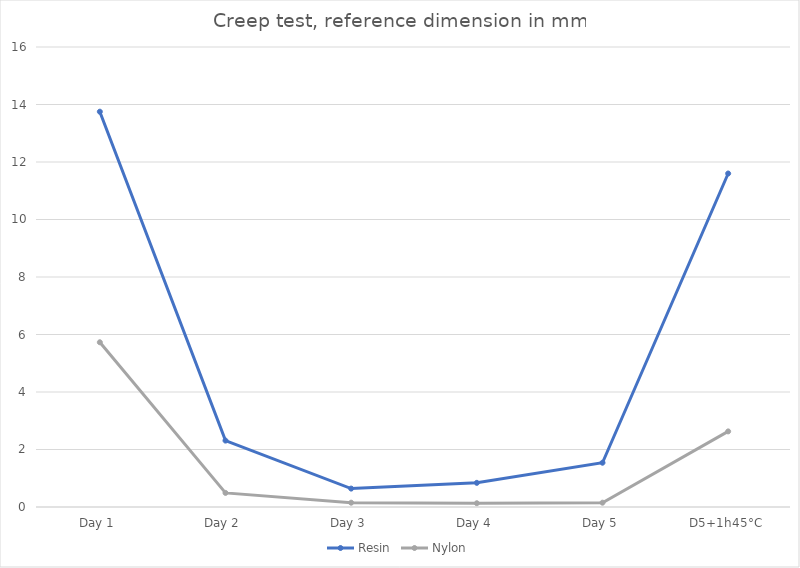
| Category | Resin | Nylon |
|---|---|---|
| Day 1 | 13.75 | 5.73 |
| Day 2 | 2.31 | 0.49 |
| Day 3 | 0.64 | 0.15 |
| Day 4 | 0.84 | 0.13 |
| Day 5 | 1.54 | 0.15 |
| D5+1h45°C | 11.6 | 2.63 |